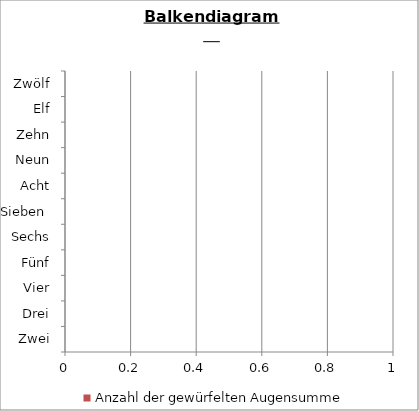
| Category | Anzahl der gewürfelten Augensumme |
|---|---|
| Zwei | 0 |
| Drei | 0 |
| Vier | 0 |
| Fünf | 0 |
| Sechs | 0 |
| Sieben  | 0 |
| Acht | 0 |
| Neun | 0 |
| Zehn | 0 |
| Elf | 0 |
| Zwölf | 0 |